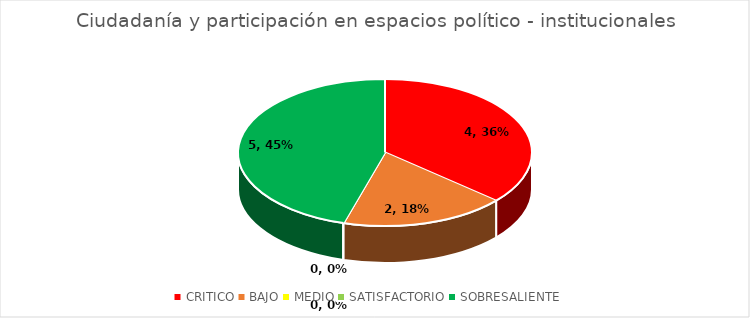
| Category | Ciudadanía y participación en espacios político - institucionales |
|---|---|
| CRITICO | 4 |
| BAJO | 2 |
| MEDIO | 0 |
| SATISFACTORIO | 0 |
| SOBRESALIENTE | 5 |